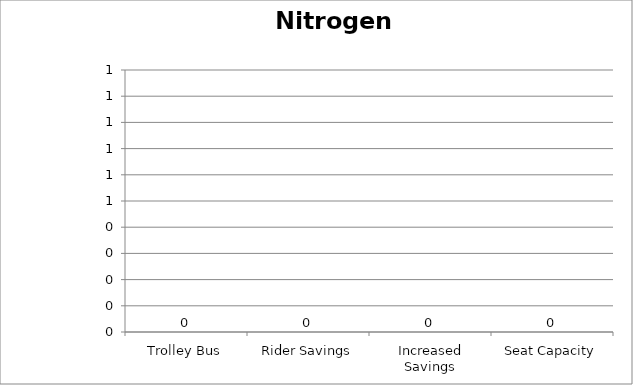
| Category | Nitrogen Oxides |
|---|---|
| Trolley Bus | 0 |
| Rider Savings | 0 |
| Increased Savings | 0 |
| Seat Capacity | 0 |